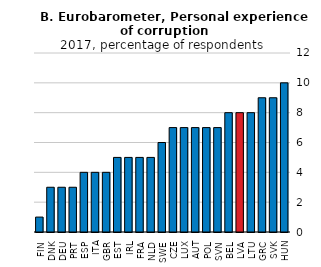
| Category | F. Eurobarometer (ii) |
|---|---|
| FIN | 1 |
| DNK | 3 |
| DEU | 3 |
| PRT | 3 |
| ESP | 4 |
| ITA | 4 |
| GBR | 4 |
| EST | 5 |
| IRL | 5 |
| FRA | 5 |
| NLD | 5 |
| SWE | 6 |
| CZE | 7 |
| LUX | 7 |
| AUT | 7 |
| POL | 7 |
| SVN | 7 |
| BEL | 8 |
| LVA | 8 |
| LTU | 8 |
| GRC | 9 |
| SVK | 9 |
| HUN | 10 |